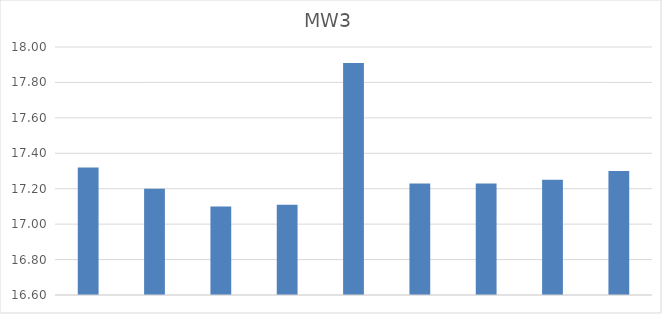
| Category | MW3 |
|---|---|
|  | 17.32 |
|  | 17.2 |
|  | 17.1 |
|  | 17.11 |
|  | 17.91 |
|  | 17.23 |
|  | 17.23 |
|  | 17.25 |
|  | 17.3 |